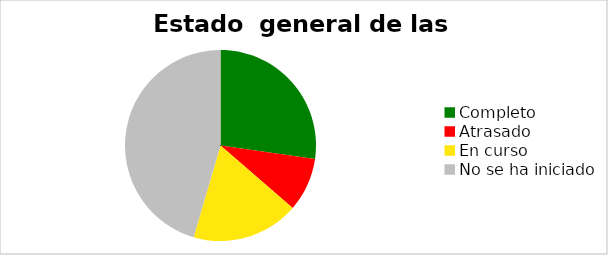
| Category | Series 0 |
|---|---|
| Completo | 0.273 |
| Atrasado | 0.091 |
| En curso | 0.182 |
| No se ha iniciado | 0.455 |